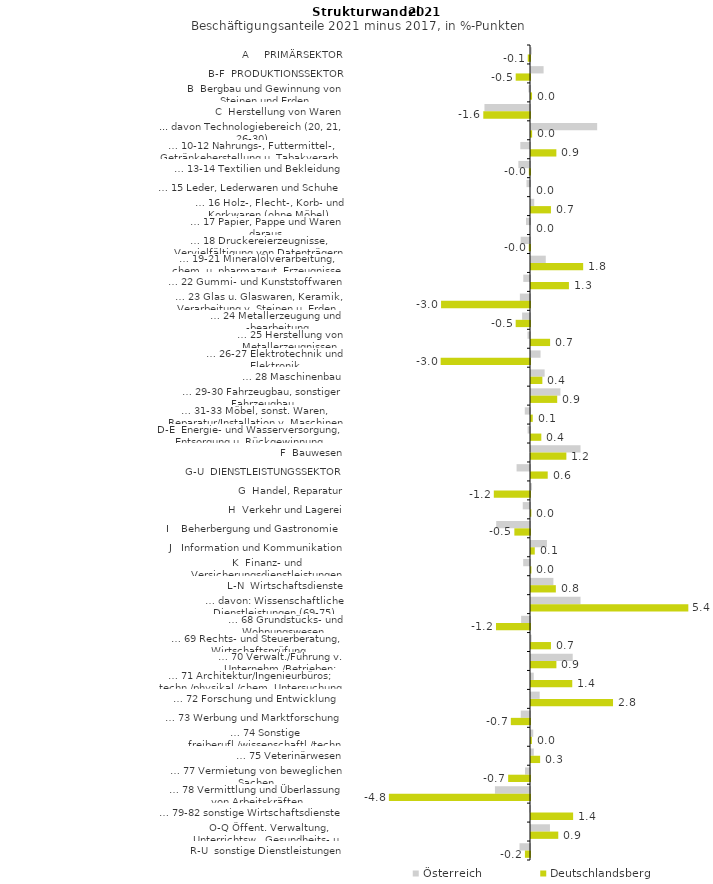
| Category | Österreich | Deutschlandsberg |
|---|---|---|
| A     PRIMÄRSEKTOR | 0.029 | -0.077 |
| B-F  PRODUKTIONSSEKTOR | 0.429 | -0.488 |
| B  Bergbau und Gewinnung von Steinen und Erden | -0.054 | 0.035 |
| C  Herstellung von Waren | -1.552 | -1.593 |
| ... davon Technologiebereich (20, 21, 26-30) | 2.256 | 0.039 |
| … 10-12 Nahrungs-, Futtermittel-, Getränkeherstellung u. Tabakverarb. | -0.33 | 0.865 |
| … 13-14 Textilien und Bekleidung | -0.397 | -0.039 |
| … 15 Leder, Lederwaren und Schuhe | -0.119 | 0 |
| … 16 Holz-, Flecht-, Korb- und Korkwaren (ohne Möbel)  | 0.11 | 0.68 |
| … 17 Papier, Pappe und Waren daraus  | -0.136 | 0 |
| … 18 Druckereierzeugnisse, Vervielfältigung von Datenträgern | -0.317 | -0.041 |
| … 19-21 Mineralölverarbeitung, chem. u. pharmazeut. Erzeugnisse | 0.503 | 1.778 |
| … 22 Gummi- und Kunststoffwaren | -0.229 | 1.293 |
| … 23 Glas u. Glaswaren, Keramik, Verarbeitung v. Steinen u. Erden  | -0.345 | -3.032 |
| … 24 Metallerzeugung und -bearbeitung | -0.269 | -0.488 |
| … 25 Herstellung von Metallerzeugnissen  | -0.086 | 0.651 |
| … 26-27 Elektrotechnik und Elektronik | 0.325 | -3.046 |
| … 28 Maschinenbau | 0.465 | 0.387 |
| … 29-30 Fahrzeugbau, sonstiger Fahrzeugbau | 1.003 | 0.893 |
| … 31-33 Möbel, sonst. Waren, Reparatur/Installation v. Maschinen | -0.178 | 0.06 |
| D-E  Energie- und Wasserversorgung, Entsorgung u. Rückgewinnung | -0.083 | 0.351 |
| F  Bauwesen | 1.689 | 1.206 |
| G-U  DIENSTLEISTUNGSSEKTOR | -0.458 | 0.57 |
| G  Handel, Reparatur | 0.035 | -1.234 |
| H  Verkehr und Lagerei | -0.247 | 0.011 |
| I    Beherbergung und Gastronomie | -1.152 | -0.533 |
| J   Information und Kommunikation | 0.543 | 0.129 |
| K  Finanz- und Versicherungsdienstleistungen | -0.232 | 0.014 |
| L-N  Wirtschaftsdienste | 0.764 | 0.847 |
| … davon: Wissenschaftliche Dienstleistungen (69-75) | 1.689 | 5.363 |
| … 68 Grundstücks- und Wohnungswesen  | -0.302 | -1.16 |
| … 69 Rechts- und Steuerberatung, Wirtschaftsprüfung | 0.021 | 0.681 |
| … 70 Verwalt./Führung v. Unternehm./Betrieben; Unternehmensberat. | 1.422 | 0.866 |
| … 71 Architektur/Ingenieurbüros; techn./physikal./chem. Untersuchung | 0.093 | 1.407 |
| … 72 Forschung und Entwicklung  | 0.296 | 2.796 |
| … 73 Werbung und Marktforschung | -0.315 | -0.654 |
| … 74 Sonstige freiberufl./wissenschaftl./techn. Tätigkeiten | 0.077 | 0.03 |
| … 75 Veterinärwesen | 0.095 | 0.311 |
| … 77 Vermietung von beweglichen Sachen  | -0.17 | -0.745 |
| … 78 Vermittlung und Überlassung von Arbeitskräften | -1.195 | -4.811 |
| … 79-82 sonstige Wirtschaftsdienste | -0.022 | 1.436 |
| O-Q Öffent. Verwaltung, Unterrichtsw., Gesundheits- u. Sozialwesen | 0.646 | 0.93 |
| R-U  sonstige Dienstleistungen | -0.357 | -0.173 |